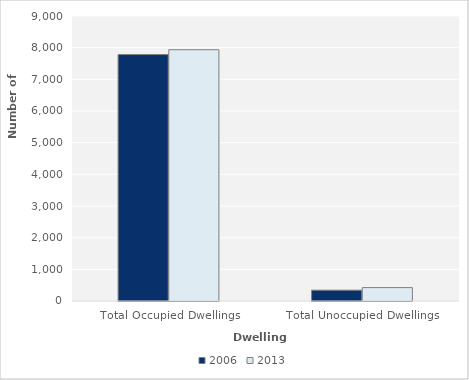
| Category | 2006 | 2013 |
|---|---|---|
| Total Occupied Dwellings | 7782 | 7935 |
| Total Unoccupied Dwellings | 342 | 423 |